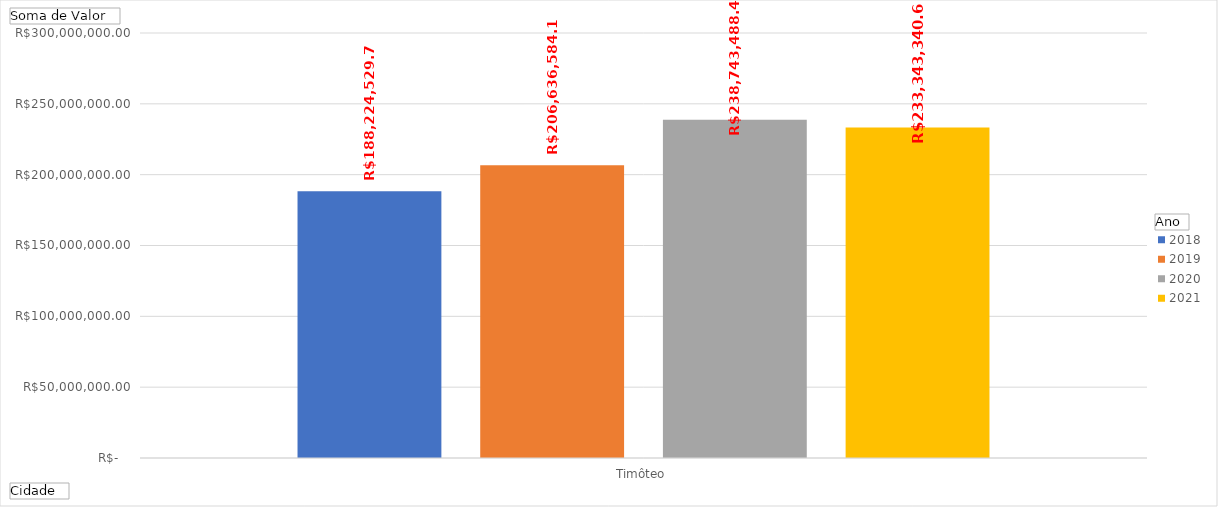
| Category | 2018 | 2019 | 2020 | 2021 |
|---|---|---|---|---|
| Timôteo | 188224529.73 | 206636584.13 | 238743488.46 | 233343340.6 |